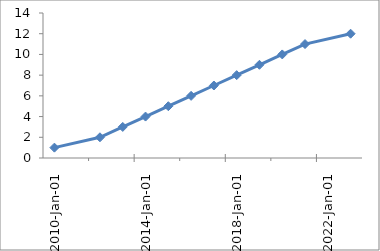
| Category | Series 1 |
|---|---|
| 2010-01-01 | 1 |
| 2012-01-01 | 2 |
| 2013-01-01 | 3 |
| 2014-01-01 | 4 |
| 2015-01-01 | 5 |
| 2016-01-01 | 6 |
| 2017-01-01 | 7 |
| 2018-01-01 | 8 |
| 2019-01-01 | 9 |
| 2020-01-01 | 10 |
| 2021-01-01 | 11 |
| 2023-01-01 | 12 |